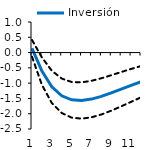
| Category | Series 0 | Inversión | Series 2 |
|---|---|---|---|
| 1.0 | 0.413 | 0.138 | -0.137 |
| 2.0 | -0.161 | -0.608 | -1.056 |
| 3.0 | -0.594 | -1.123 | -1.652 |
| 4.0 | -0.85 | -1.414 | -1.978 |
| 5.0 | -0.962 | -1.545 | -2.128 |
| 6.0 | -0.974 | -1.567 | -2.161 |
| 7.0 | -0.924 | -1.521 | -2.118 |
| 8.0 | -0.84 | -1.433 | -2.025 |
| 9.0 | -0.741 | -1.321 | -1.9 |
| 10.0 | -0.637 | -1.198 | -1.759 |
| 11.0 | -0.535 | -1.074 | -1.612 |
| 12.0 | -0.441 | -0.953 | -1.464 |